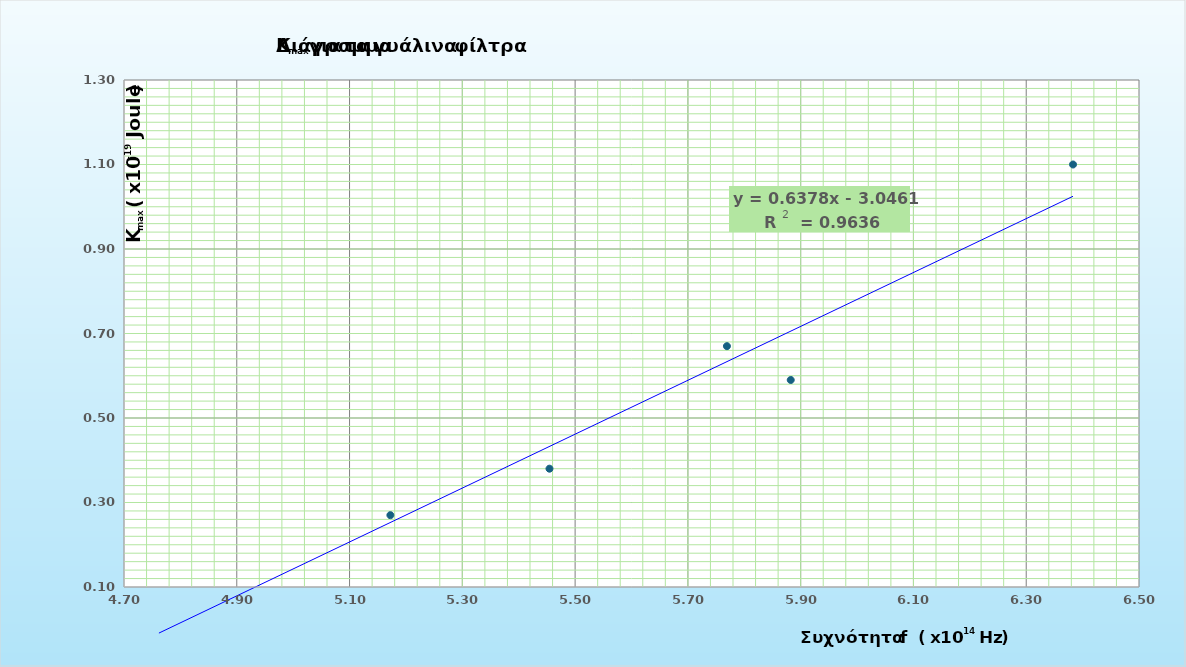
| Category | Kmax (x10^-19 Joule) (Kmax =qe*V) |
|---|---|
| 4.76190476190476 | 0.03 |
| 5.17241379310345 | 0.27 |
| 5.45454545454545 | 0.38 |
| 5.76923076923077 | 0.67 |
| 5.88235294117647 | 0.59 |
| 6.38297872340426 | 1.1 |